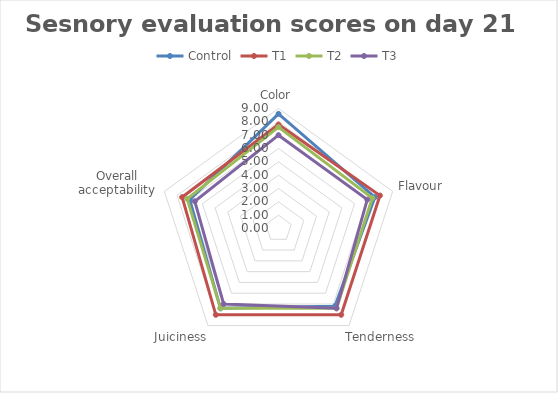
| Category | Control | T1 | T2 | T3 |
|---|---|---|---|---|
| Color | 8.6 | 7.8 | 7.6 | 7 |
| Flavour | 7.6 | 8 | 7.4 | 7 |
| Tenderness | 7.2 | 8 | 7.4 | 7.4 |
| Juiciness | 7.4 | 8 | 7.4 | 7 |
| Overall acceptability | 7 | 7.6 | 7.2 | 6.6 |